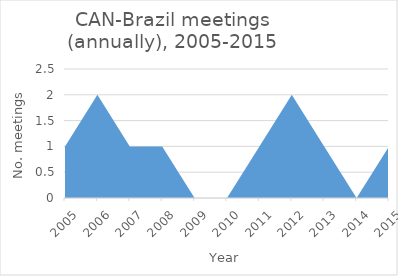
| Category | Number of meetings |
|---|---|
| 2005.0 | 1 |
| 2006.0 | 2 |
| 2007.0 | 1 |
| 2008.0 | 1 |
| 2009.0 | 0 |
| 2010.0 | 0 |
| 2011.0 | 1 |
| 2012.0 | 2 |
| 2013.0 | 1 |
| 2014.0 | 0 |
| 2015.0 | 1 |